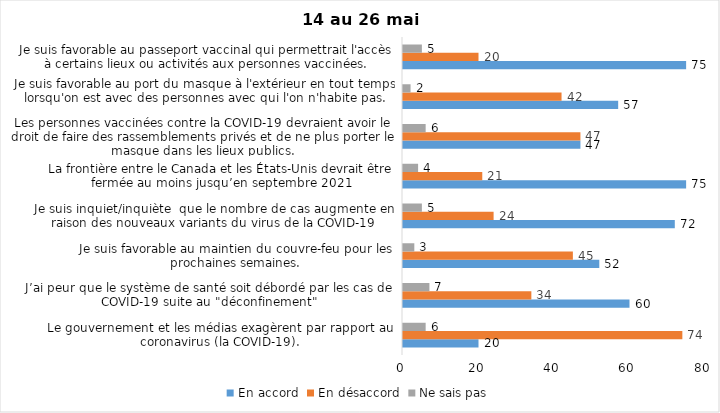
| Category | En accord | En désaccord | Ne sais pas |
|---|---|---|---|
| Le gouvernement et les médias exagèrent par rapport au coronavirus (la COVID-19). | 20 | 74 | 6 |
| J’ai peur que le système de santé soit débordé par les cas de COVID-19 suite au "déconfinement" | 60 | 34 | 7 |
| Je suis favorable au maintien du couvre-feu pour les prochaines semaines. | 52 | 45 | 3 |
| Je suis inquiet/inquiète  que le nombre de cas augmente en raison des nouveaux variants du virus de la COVID-19 | 72 | 24 | 5 |
| La frontière entre le Canada et les États-Unis devrait être fermée au moins jusqu’en septembre 2021 | 75 | 21 | 4 |
| Les personnes vaccinées contre la COVID-19 devraient avoir le droit de faire des rassemblements privés et de ne plus porter le masque dans les lieux publics. | 47 | 47 | 6 |
| Je suis favorable au port du masque à l'extérieur en tout temps lorsqu'on est avec des personnes avec qui l'on n'habite pas. | 57 | 42 | 2 |
| Je suis favorable au passeport vaccinal qui permettrait l'accès à certains lieux ou activités aux personnes vaccinées. | 75 | 20 | 5 |